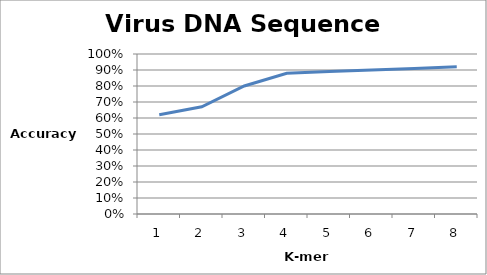
| Category | Series 0 |
|---|---|
| 0 | 0.62 |
| 1 | 0.67 |
| 2 | 0.8 |
| 3 | 0.88 |
| 4 | 0.89 |
| 5 | 0.9 |
| 6 | 0.91 |
| 7 | 0.92 |